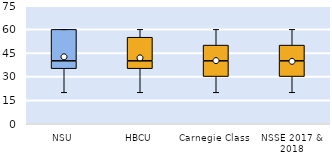
| Category | 25th | 50th | 75th |
|---|---|---|---|
| NSU | 35 | 5 | 20 |
| HBCU | 35 | 5 | 15 |
| Carnegie Class | 30 | 10 | 10 |
| NSSE 2017 & 2018 | 30 | 10 | 10 |